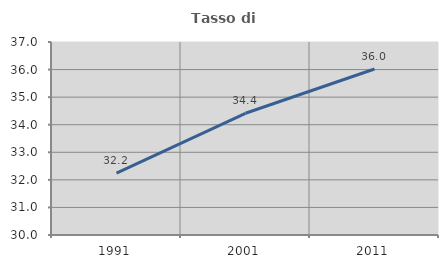
| Category | Tasso di occupazione   |
|---|---|
| 1991.0 | 32.241 |
| 2001.0 | 34.415 |
| 2011.0 | 36.02 |